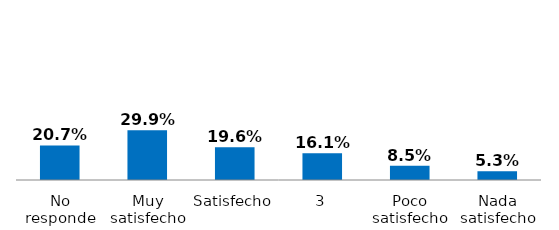
| Category | Series 0 |
|---|---|
| Nada satisfecho | 0.053 |
| Poco satisfecho | 0.085 |
| 3 | 0.161 |
| Satisfecho | 0.196 |
| Muy satisfecho | 0.299 |
| No responde | 0.207 |